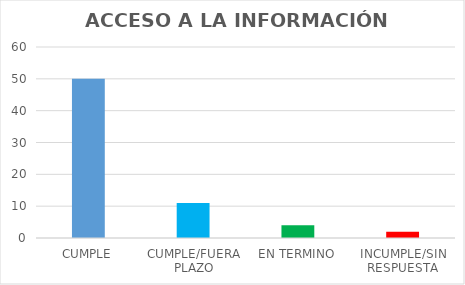
| Category | TOTAL |
|---|---|
| CUMPLE | 50 |
| CUMPLE/FUERA PLAZO | 11 |
| EN TERMINO | 4 |
| INCUMPLE/SIN RESPUESTA | 2 |